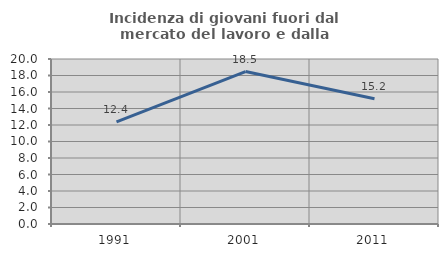
| Category | Incidenza di giovani fuori dal mercato del lavoro e dalla formazione  |
|---|---|
| 1991.0 | 12.371 |
| 2001.0 | 18.478 |
| 2011.0 | 15.179 |